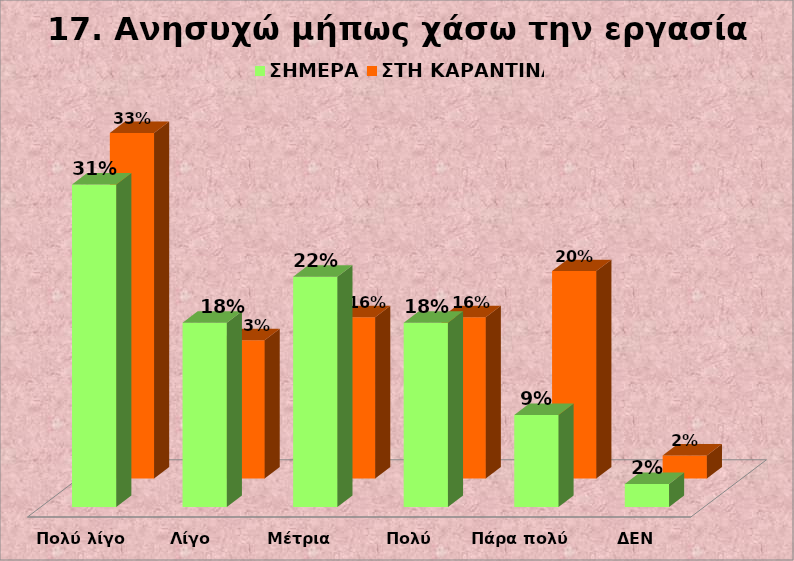
| Category | Series 0 | ΣΗΜΕΡΑ  | ΣΤΗ ΚΑΡΑΝΤΙΝΑ |
|---|---|---|---|
| Πολύ λίγο |  | 0.311 | 0.333 |
| Λίγο |  | 0.178 | 0.133 |
| Μέτρια  |  | 0.222 | 0.156 |
| Πολύ  |  | 0.178 | 0.156 |
| Πάρα πολύ  |  | 0.089 | 0.2 |
| ΔΕΝ ΑΠΑΝΤΩ |  | 0.022 | 0.022 |